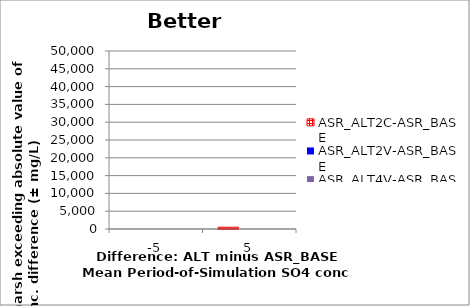
| Category | ASR_ALT2C-ASR_BASE | ASR_ALT2V-ASR_BASE | ASR_ALT4V-ASR_BASE |
|---|---|---|---|
| -5.0 | 0 | 0 | 0 |
| 5.0 | 500 | 0 | 0 |